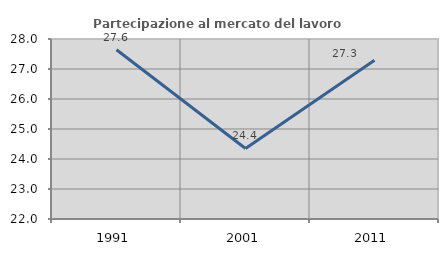
| Category | Partecipazione al mercato del lavoro  femminile |
|---|---|
| 1991.0 | 27.642 |
| 2001.0 | 24.351 |
| 2011.0 | 27.291 |